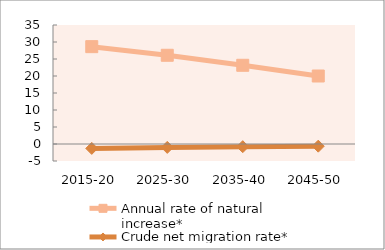
| Category | Annual rate of natural increase* | Crude net migration rate* |
|---|---|---|
| 2015-20 | 28.631 | -1.3 |
| 2025-30 | 26.097 | -1 |
| 2035-40 | 23.148 | -0.789 |
| 2045-50 | 19.997 | -0.64 |